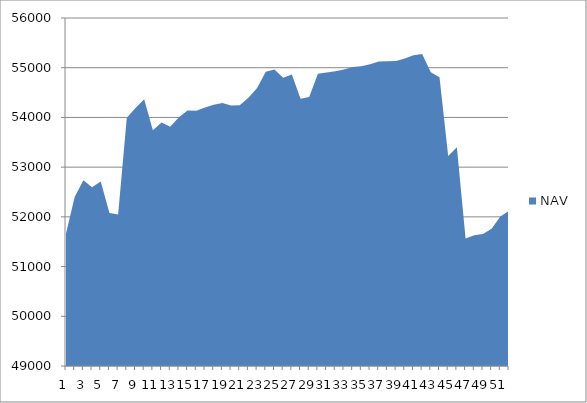
| Category | NAV |
|---|---|
| 0 | 51667 |
| 1 | 52397 |
| 2 | 52733.957 |
| 3 | 52597.875 |
| 4 | 52708.772 |
| 5 | 52075.184 |
| 6 | 52046.775 |
| 7 | 53991.219 |
| 8 | 54189.909 |
| 9 | 54364.909 |
| 10 | 53739.909 |
| 11 | 53899.542 |
| 12 | 53812.294 |
| 13 | 54003.961 |
| 14 | 54140.037 |
| 15 | 54132.37 |
| 16 | 54197.37 |
| 17 | 54255.812 |
| 18 | 54292.622 |
| 19 | 54240.699 |
| 20 | 54246.834 |
| 21 | 54397.391 |
| 22 | 54592.197 |
| 23 | 54920.119 |
| 24 | 54963.245 |
| 25 | 54796.799 |
| 26 | 54863.963 |
| 27 | 54375.975 |
| 28 | 54409.015 |
| 29 | 54878.402 |
| 30 | 54905.151 |
| 31 | 54927.958 |
| 32 | 54964.157 |
| 33 | 55012.385 |
| 34 | 55031.616 |
| 35 | 55070.791 |
| 36 | 55126.461 |
| 37 | 55131.71 |
| 38 | 55133.391 |
| 39 | 55184.783 |
| 40 | 55249.119 |
| 41 | 55278.196 |
| 42 | 54909.993 |
| 43 | 54807.052 |
| 44 | 53224.092 |
| 45 | 53401.214 |
| 46 | 51567.133 |
| 47 | 51627.536 |
| 48 | 51656.382 |
| 49 | 51762.295 |
| 50 | 52007.329 |
| 51 | 52120.149 |